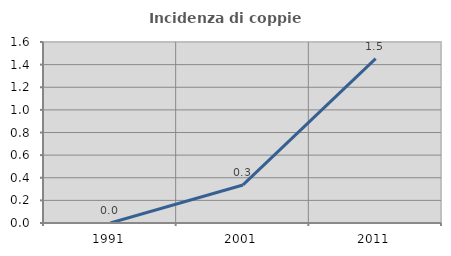
| Category | Incidenza di coppie miste |
|---|---|
| 1991.0 | 0 |
| 2001.0 | 0.336 |
| 2011.0 | 1.453 |